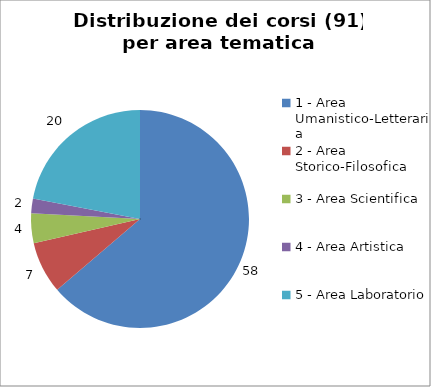
| Category | Nr. Corsi |
|---|---|
| 1 - Area Umanistico-Letteraria | 58 |
| 2 - Area Storico-Filosofica | 7 |
| 3 - Area Scientifica | 4 |
| 4 - Area Artistica | 2 |
| 5 - Area Laboratorio | 20 |